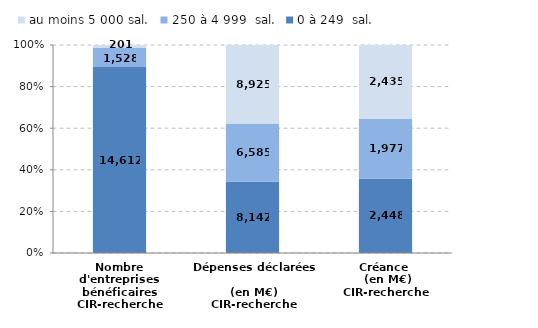
| Category | 0 à 249  sal. | 250 à 4 999  sal. | au moins 5 000 sal. |
|---|---|---|---|
| Nombre d'entreprises bénéficaires
CIR-recherche | 14612 | 1528 | 201 |
| Dépenses déclarées 
(en M€)
CIR-recherche | 8142.09 | 6584.5 | 8925.36 |
| Créance 
 (en M€)
CIR-recherche | 2447.52 | 1976.92 | 2435.02 |